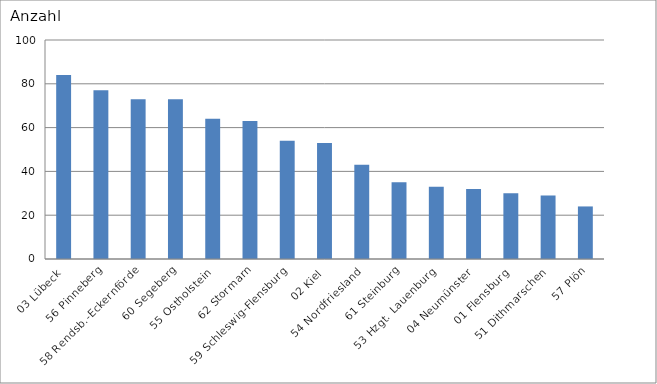
| Category | 03 Lübeck 56 Pinneberg 58 Rendsb.-Eckernförde 60 Segeberg 55 Ostholstein 62 Stormarn 59 Schleswig-Flensburg 02 Kiel 54 Nordfriesland 61 Steinburg 53 Hzgt. Lauenburg 04 Neumünster 01 Flensburg 51 Dithmarschen 57 Plön |
|---|---|
| 03 Lübeck | 84 |
| 56 Pinneberg | 77 |
| 58 Rendsb.-Eckernförde | 73 |
| 60 Segeberg | 73 |
| 55 Ostholstein | 64 |
| 62 Stormarn | 63 |
| 59 Schleswig-Flensburg | 54 |
| 02 Kiel | 53 |
| 54 Nordfriesland | 43 |
| 61 Steinburg | 35 |
| 53 Hzgt. Lauenburg | 33 |
| 04 Neumünster | 32 |
| 01 Flensburg | 30 |
| 51 Dithmarschen | 29 |
| 57 Plön | 24 |